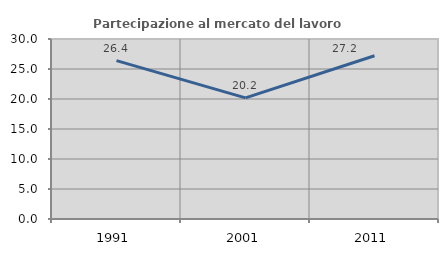
| Category | Partecipazione al mercato del lavoro  femminile |
|---|---|
| 1991.0 | 26.388 |
| 2001.0 | 20.196 |
| 2011.0 | 27.201 |